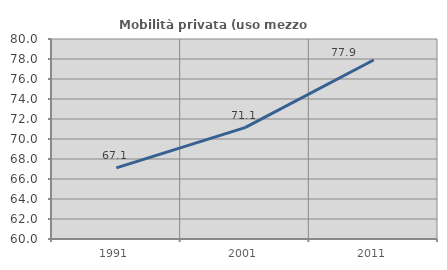
| Category | Mobilità privata (uso mezzo privato) |
|---|---|
| 1991.0 | 67.114 |
| 2001.0 | 71.134 |
| 2011.0 | 77.903 |